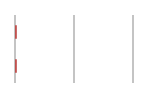
| Category | Series 0 |
|---|---|
| 0 | 0.007 |
| 1 | 0.007 |